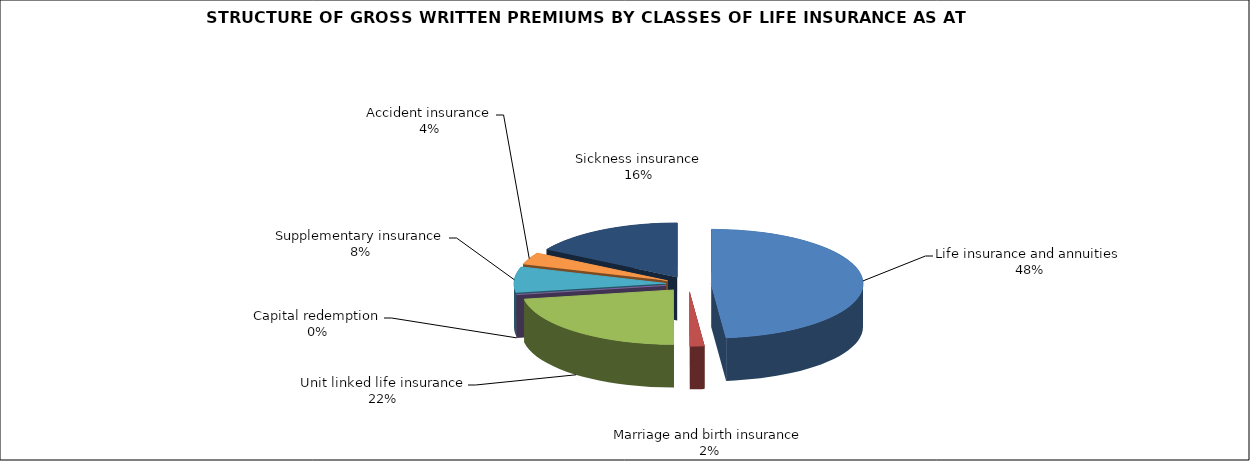
| Category | Life insurance and annuities |
|---|---|
| Life insurance and annuities | 0.484 |
| Marriage and birth insurance | 0.015 |
| Unit linked life insurance | 0.223 |
| Capital redemption | 0 |
| Supplementary insurance | 0.076 |
| Accident insurance | 0.036 |
| Sickness insurance | 0.165 |